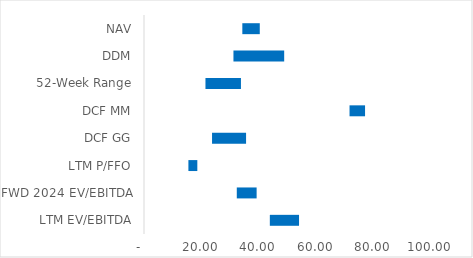
| Category | Min | Spread | Max |
|---|---|---|---|
| LTM EV/EBITDA | 43.997 | 10.212 | 54.208 |
| FWD 2024 EV/EBITDA | 32.443 | 6.937 | 39.38 |
| LTM P/FFO | 15.525 | 3.12 | 18.645 |
| DCF GG | 23.791 | 11.896 | 35.688 |
| DCF MM | 71.864 | 5.427 | 77.291 |
| 52-Week Range | 21.49 | 12.41 | 33.9 |
| DDM | 31.277 | 17.74 | 49.017 |
| NAV | 34.38 | 6.1 | 40.48 |